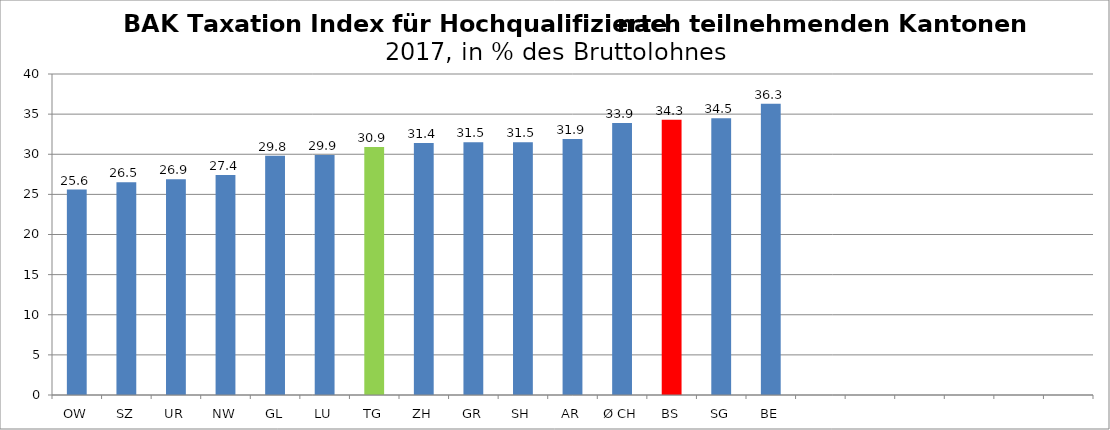
| Category | Series 0 |
|---|---|
| OW | 25.6 |
| SZ | 26.5 |
| UR | 26.9 |
| NW | 27.4 |
| GL | 29.8 |
| LU | 29.9 |
| TG | 30.9 |
| ZH | 31.4 |
| GR | 31.5 |
| SH | 31.5 |
| AR | 31.9 |
| Ø CH | 33.9 |
| BS | 34.3 |
| SG | 34.5 |
| BE | 36.3 |